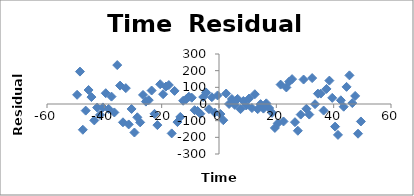
| Category | Series 0 |
|---|---|
| -49.5 | 55.105 |
| -48.5 | 194.395 |
| -47.5 | -154.579 |
| -46.5 | -39.675 |
| -45.5 | 83.977 |
| -44.5 | 41.561 |
| -43.5 | -98.526 |
| -42.5 | -21.192 |
| -41.5 | -65.416 |
| -40.5 | -20.591 |
| -39.5 | 64.778 |
| -38.5 | -29.43 |
| -37.5 | 44.289 |
| -36.5 | -50.67 |
| -35.5 | 233.565 |
| -34.5 | 110.369 |
| -33.5 | -109.848 |
| -32.5 | 95.19 |
| -31.5 | -122.677 |
| -30.5 | -29.747 |
| -29.5 | -171.073 |
| -28.5 | -79.726 |
| -27.5 | -110.271 |
| -26.5 | 54.315 |
| -25.5 | 14.426 |
| -24.5 | 23.229 |
| -23.5 | 80.87 |
| -22.5 | -59.048 |
| -21.5 | -126.587 |
| -20.5 | 118.469 |
| -19.5 | 58.811 |
| -18.5 | 104.686 |
| -17.5 | 113.575 |
| -16.5 | -176.455 |
| -15.5 | 78.644 |
| -14.5 | -108.453 |
| -13.5 | -77.578 |
| -12.5 | 19.421 |
| -11.5 | 28.225 |
| -10.5 | 43.808 |
| -9.5 | 37.723 |
| -8.5 | -37.036 |
| -7.5 | -41.627 |
| -6.5 | -58.211 |
| -5.5 | 41.957 |
| -4.5 | 69.218 |
| -3.5 | -30.872 |
| -2.5 | 40.828 |
| -1.5 | -51.315 |
| -0.5 | 51.317 |
| 0.5 | -60.248 |
| 1.5 | -97.284 |
| 2.5 | 62.776 |
| 3.5 | 0.099 |
| 4.5 | 30.112 |
| 5.5 | -5.355 |
| 6.5 | 30.671 |
| 7.5 | -31 |
| 8.5 | 17.972 |
| 9.5 | -8.813 |
| 10.5 | 32.876 |
| 11.5 | -24.026 |
| 12.5 | 58.675 |
| 13.5 | -30.706 |
| 14.5 | -0.69 |
| 15.5 | -27.746 |
| 16.5 | 3.983 |
| 17.5 | -24.245 |
| 18.5 | -52.932 |
| 19.5 | -143.573 |
| 20.5 | -116.131 |
| 21.5 | 116.337 |
| 22.5 | -104.78 |
| 23.5 | 99.324 |
| 24.5 | 134.425 |
| 25.5 | 149.334 |
| 26.5 | -109.06 |
| 27.5 | -160.566 |
| 28.5 | -63.546 |
| 29.5 | 146.773 |
| 30.5 | -28.706 |
| 31.5 | -63.325 |
| 32.5 | 155.554 |
| 33.5 | -1.04 |
| 34.5 | 62.12 |
| 35.5 | 62.462 |
| 36.5 | -39.324 |
| 37.5 | 90.447 |
| 38.5 | 140.318 |
| 39.5 | 36.84 |
| 40.5 | -135.789 |
| 41.5 | -185.418 |
| 42.5 | 22.14 |
| 43.5 | -16.307 |
| 44.5 | 102.799 |
| 45.5 | 171.75 |
| 46.5 | 5.54 |
| 47.5 | 48.332 |
| 48.5 | -178.292 |
| 49.5 | -104.901 |